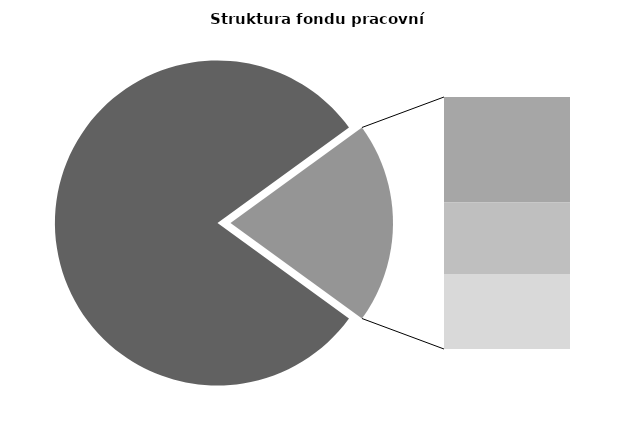
| Category | Series 0 |
|---|---|
| Průměrná měsíční odpracovaná doba bez přesčasu | 135.583 |
| Dovolená | 14.172 |
| Nemoc | 9.624 |
| Jiné | 10.092 |